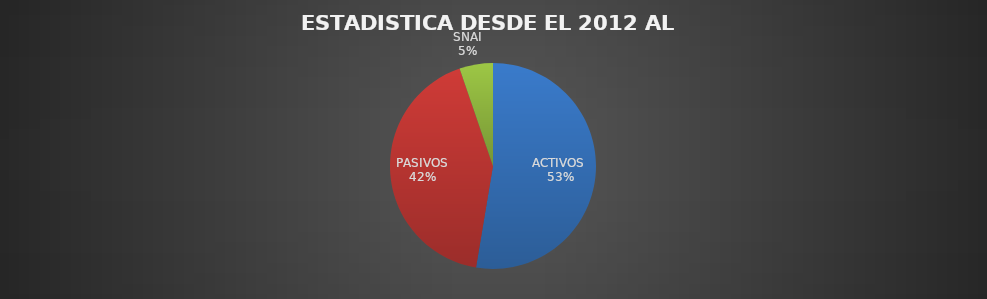
| Category | Series 0 |
|---|---|
| ACTIVOS  | 60 |
| PASIVOS | 48 |
| SNAI | 6 |